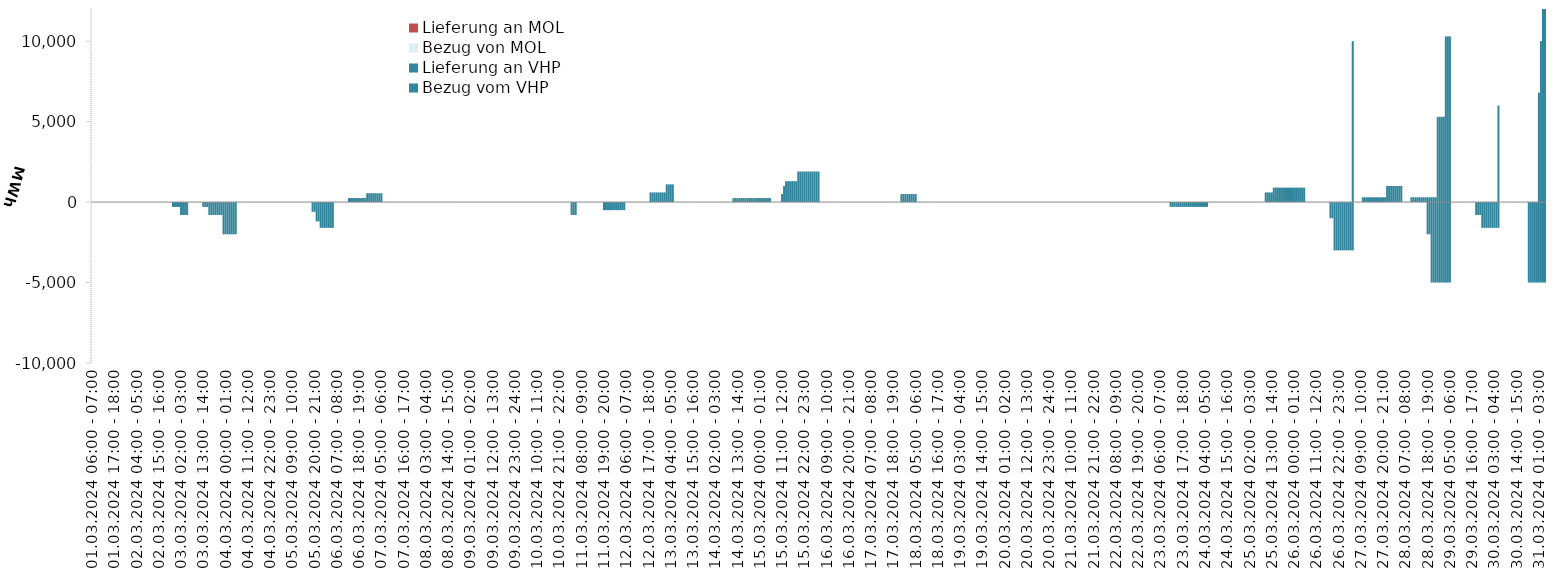
| Category | Bezug vom VHP | Lieferung an VHP | Bezug von MOL | Lieferung an MOL |
|---|---|---|---|---|
| 01.03.2024 06:00 - 07:00 | 0 | 0 | 0 | 0 |
| 01.03.2024 07:00 - 08:00 | 0 | 0 | 0 | 0 |
| 01.03.2024 08:00 - 09:00 | 0 | 0 | 0 | 0 |
| 01.03.2024 09:00 - 10:00 | 0 | 0 | 0 | 0 |
| 01.03.2024 10:00 - 11:00 | 0 | 0 | 0 | 0 |
| 01.03.2024 11:00 - 12:00 | 0 | 0 | 0 | 0 |
| 01.03.2024 12:00 - 13:00 | 0 | 0 | 0 | 0 |
| 01.03.2024 13:00 - 14:00 | 0 | 0 | 0 | 0 |
| 01.03.2024 14:00 - 15:00 | 0 | 0 | 0 | 0 |
| 01.03.2024 15:00 - 16:00 | 0 | 0 | 0 | 0 |
| 01.03.2024 16:00 - 17:00 | 0 | 0 | 0 | 0 |
| 01.03.2024 17:00 - 18:00 | 0 | 0 | 0 | 0 |
| 01.03.2024 18:00 - 19:00 | 0 | 0 | 0 | 0 |
| 01.03.2024 19:00 - 20:00 | 0 | 0 | 0 | 0 |
| 01.03.2024 20:00 - 21:00 | 0 | 0 | 0 | 0 |
| 01.03.2024 21:00 - 22:00 | 0 | 0 | 0 | 0 |
| 01.03.2024 22:00 - 23:00 | 0 | 0 | 0 | 0 |
| 01.03.2024 23:00 - 24:00 | 0 | 0 | 0 | 0 |
| 02.03.2024 00:00 - 01:00 | 0 | 0 | 0 | 0 |
| 02.03.2024 01:00 - 02:00 | 0 | 0 | 0 | 0 |
| 02.03.2024 02:00 - 03:00 | 0 | 0 | 0 | 0 |
| 02.03.2024 03:00 - 04:00 | 0 | 0 | 0 | 0 |
| 02.03.2024 04:00 - 05:00 | 0 | 0 | 0 | 0 |
| 02.03.2024 05:00 - 06:00 | 0 | 0 | 0 | 0 |
| 02.03.2024 06:00 - 07:00 | 0 | 0 | 0 | 0 |
| 02.03.2024 07:00 - 08:00 | 0 | 0 | 0 | 0 |
| 02.03.2024 08:00 - 09:00 | 0 | 0 | 0 | 0 |
| 02.03.2024 09:00 - 10:00 | 0 | 0 | 0 | 0 |
| 02.03.2024 10:00 - 11:00 | 0 | 0 | 0 | 0 |
| 02.03.2024 11:00 - 12:00 | 0 | 0 | 0 | 0 |
| 02.03.2024 12:00 - 13:00 | 0 | 0 | 0 | 0 |
| 02.03.2024 13:00 - 14:00 | 0 | 0 | 0 | 0 |
| 02.03.2024 14:00 - 15:00 | 0 | 0 | 0 | 0 |
| 02.03.2024 15:00 - 16:00 | 0 | 0 | 0 | 0 |
| 02.03.2024 16:00 - 17:00 | 0 | 0 | 0 | 0 |
| 02.03.2024 17:00 - 18:00 | 0 | 0 | 0 | 0 |
| 02.03.2024 18:00 - 19:00 | 0 | 0 | 0 | 0 |
| 02.03.2024 19:00 - 20:00 | 0 | 0 | 0 | 0 |
| 02.03.2024 20:00 - 21:00 | 0 | 0 | 0 | 0 |
| 02.03.2024 21:00 - 22:00 | 0 | 0 | 0 | 0 |
| 02.03.2024 22:00 - 23:00 | 0 | -300 | 0 | 0 |
| 02.03.2024 23:00 - 24:00 | 0 | -300 | 0 | 0 |
| 03.03.2024 00:00 - 01:00 | 0 | -300 | 0 | 0 |
| 03.03.2024 01:00 - 02:00 | 0 | -300 | 0 | 0 |
| 03.03.2024 02:00 - 03:00 | 0 | -800 | 0 | 0 |
| 03.03.2024 03:00 - 04:00 | 0 | -800 | 0 | 0 |
| 03.03.2024 04:00 - 05:00 | 0 | -800 | 0 | 0 |
| 03.03.2024 05:00 - 06:00 | 0 | -800 | 0 | 0 |
| 03.03.2024 06:00 - 07:00 | 0 | 0 | 0 | 0 |
| 03.03.2024 07:00 - 08:00 | 0 | 0 | 0 | 0 |
| 03.03.2024 08:00 - 09:00 | 0 | 0 | 0 | 0 |
| 03.03.2024 09:00 - 10:00 | 0 | 0 | 0 | 0 |
| 03.03.2024 10:00 - 11:00 | 0 | 0 | 0 | 0 |
| 03.03.2024 11:00 - 12:00 | 0 | 0 | 0 | 0 |
| 03.03.2024 12:00 - 13:00 | 0 | 0 | 0 | 0 |
| 03.03.2024 13:00 - 14:00 | 0 | -300 | 0 | 0 |
| 03.03.2024 14:00 - 15:00 | 0 | -300 | 0 | 0 |
| 03.03.2024 15:00 - 16:00 | 0 | -300 | 0 | 0 |
| 03.03.2024 16:00 - 17:00 | 0 | -800 | 0 | 0 |
| 03.03.2024 17:00 - 18:00 | 0 | -800 | 0 | 0 |
| 03.03.2024 18:00 - 19:00 | 0 | -800 | 0 | 0 |
| 03.03.2024 19:00 - 20:00 | 0 | -800 | 0 | 0 |
| 03.03.2024 20:00 - 21:00 | 0 | -800 | 0 | 0 |
| 03.03.2024 21:00 - 22:00 | 0 | -800 | 0 | 0 |
| 03.03.2024 22:00 - 23:00 | 0 | -800 | 0 | 0 |
| 03.03.2024 23:00 - 24:00 | 0 | -2000 | 0 | 0 |
| 04.03.2024 00:00 - 01:00 | 0 | -2000 | 0 | 0 |
| 04.03.2024 01:00 - 02:00 | 0 | -2000 | 0 | 0 |
| 04.03.2024 02:00 - 03:00 | 0 | -2000 | 0 | 0 |
| 04.03.2024 03:00 - 04:00 | 0 | -2000 | 0 | 0 |
| 04.03.2024 04:00 - 05:00 | 0 | -2000 | 0 | 0 |
| 04.03.2024 05:00 - 06:00 | 0 | -2000 | 0 | 0 |
| 04.03.2024 06:00 - 07:00 | 0 | 0 | 0 | 0 |
| 04.03.2024 07:00 - 08:00 | 0 | 0 | 0 | 0 |
| 04.03.2024 08:00 - 09:00 | 0 | 0 | 0 | 0 |
| 04.03.2024 09:00 - 10:00 | 0 | 0 | 0 | 0 |
| 04.03.2024 10:00 - 11:00 | 0 | 0 | 0 | 0 |
| 04.03.2024 11:00 - 12:00 | 0 | 0 | 0 | 0 |
| 04.03.2024 12:00 - 13:00 | 0 | 0 | 0 | 0 |
| 04.03.2024 13:00 - 14:00 | 0 | 0 | 0 | 0 |
| 04.03.2024 14:00 - 15:00 | 0 | 0 | 0 | 0 |
| 04.03.2024 15:00 - 16:00 | 0 | 0 | 0 | 0 |
| 04.03.2024 16:00 - 17:00 | 0 | 0 | 0 | 0 |
| 04.03.2024 17:00 - 18:00 | 0 | 0 | 0 | 0 |
| 04.03.2024 18:00 - 19:00 | 0 | 0 | 0 | 0 |
| 04.03.2024 19:00 - 20:00 | 0 | 0 | 0 | 0 |
| 04.03.2024 20:00 - 21:00 | 0 | 0 | 0 | 0 |
| 04.03.2024 21:00 - 22:00 | 0 | 0 | 0 | 0 |
| 04.03.2024 22:00 - 23:00 | 0 | 0 | 0 | 0 |
| 04.03.2024 23:00 - 24:00 | 0 | 0 | 0 | 0 |
| 05.03.2024 00:00 - 01:00 | 0 | 0 | 0 | 0 |
| 05.03.2024 01:00 - 02:00 | 0 | 0 | 0 | 0 |
| 05.03.2024 02:00 - 03:00 | 0 | 0 | 0 | 0 |
| 05.03.2024 03:00 - 04:00 | 0 | 0 | 0 | 0 |
| 05.03.2024 04:00 - 05:00 | 0 | 0 | 0 | 0 |
| 05.03.2024 05:00 - 06:00 | 0 | 0 | 0 | 0 |
| 05.03.2024 06:00 - 07:00 | 0 | 0 | 0 | 0 |
| 05.03.2024 07:00 - 08:00 | 0 | 0 | 0 | 0 |
| 05.03.2024 08:00 - 09:00 | 0 | 0 | 0 | 0 |
| 05.03.2024 09:00 - 10:00 | 0 | 0 | 0 | 0 |
| 05.03.2024 10:00 - 11:00 | 0 | 0 | 0 | 0 |
| 05.03.2024 11:00 - 12:00 | 0 | 0 | 0 | 0 |
| 05.03.2024 12:00 - 13:00 | 0 | 0 | 0 | 0 |
| 05.03.2024 13:00 - 14:00 | 0 | 0 | 0 | 0 |
| 05.03.2024 14:00 - 15:00 | 0 | 0 | 0 | 0 |
| 05.03.2024 15:00 - 16:00 | 0 | 0 | 0 | 0 |
| 05.03.2024 16:00 - 17:00 | 0 | 0 | 0 | 0 |
| 05.03.2024 17:00 - 18:00 | 0 | 0 | 0 | 0 |
| 05.03.2024 18:00 - 19:00 | 0 | 0 | 0 | 0 |
| 05.03.2024 19:00 - 20:00 | 0 | -600 | 0 | 0 |
| 05.03.2024 20:00 - 21:00 | 0 | -600 | 0 | 0 |
| 05.03.2024 21:00 - 22:00 | 0 | -1200 | 0 | 0 |
| 05.03.2024 22:00 - 23:00 | 0 | -1200 | 0 | 0 |
| 05.03.2024 23:00 - 24:00 | 0 | -1600 | 0 | 0 |
| 06.03.2024 00:00 - 01:00 | 0 | -1600 | 0 | 0 |
| 06.03.2024 01:00 - 02:00 | 0 | -1600 | 0 | 0 |
| 06.03.2024 02:00 - 03:00 | 0 | -1600 | 0 | 0 |
| 06.03.2024 03:00 - 04:00 | 0 | -1600 | 0 | 0 |
| 06.03.2024 04:00 - 05:00 | 0 | -1600 | 0 | 0 |
| 06.03.2024 05:00 - 06:00 | 0 | -1600 | 0 | 0 |
| 06.03.2024 06:00 - 07:00 | 0 | 0 | 0 | 0 |
| 06.03.2024 07:00 - 08:00 | 0 | 0 | 0 | 0 |
| 06.03.2024 08:00 - 09:00 | 0 | 0 | 0 | 0 |
| 06.03.2024 09:00 - 10:00 | 0 | 0 | 0 | 0 |
| 06.03.2024 10:00 - 11:00 | 0 | 0 | 0 | 0 |
| 06.03.2024 11:00 - 12:00 | 0 | 0 | 0 | 0 |
| 06.03.2024 12:00 - 13:00 | 0 | 0 | 0 | 0 |
| 06.03.2024 13:00 - 14:00 | 250 | 0 | 0 | 0 |
| 06.03.2024 14:00 - 15:00 | 250 | 0 | 0 | 0 |
| 06.03.2024 15:00 - 16:00 | 250 | 0 | 0 | 0 |
| 06.03.2024 16:00 - 17:00 | 250 | 0 | 0 | 0 |
| 06.03.2024 17:00 - 18:00 | 250 | 0 | 0 | 0 |
| 06.03.2024 18:00 - 19:00 | 250 | 0 | 0 | 0 |
| 06.03.2024 19:00 - 20:00 | 250 | 0 | 0 | 0 |
| 06.03.2024 20:00 - 21:00 | 250 | 0 | 0 | 0 |
| 06.03.2024 21:00 - 22:00 | 250 | 0 | 0 | 0 |
| 06.03.2024 22:00 - 23:00 | 550 | 0 | 0 | 0 |
| 06.03.2024 23:00 - 24:00 | 550 | 0 | 0 | 0 |
| 07.03.2024 00:00 - 01:00 | 550 | 0 | 0 | 0 |
| 07.03.2024 01:00 - 02:00 | 550 | 0 | 0 | 0 |
| 07.03.2024 02:00 - 03:00 | 550 | 0 | 0 | 0 |
| 07.03.2024 03:00 - 04:00 | 550 | 0 | 0 | 0 |
| 07.03.2024 04:00 - 05:00 | 550 | 0 | 0 | 0 |
| 07.03.2024 05:00 - 06:00 | 550 | 0 | 0 | 0 |
| 07.03.2024 06:00 - 07:00 | 0 | 0 | 0 | 0 |
| 07.03.2024 07:00 - 08:00 | 0 | 0 | 0 | 0 |
| 07.03.2024 08:00 - 09:00 | 0 | 0 | 0 | 0 |
| 07.03.2024 09:00 - 10:00 | 0 | 0 | 0 | 0 |
| 07.03.2024 10:00 - 11:00 | 0 | 0 | 0 | 0 |
| 07.03.2024 11:00 - 12:00 | 0 | 0 | 0 | 0 |
| 07.03.2024 12:00 - 13:00 | 0 | 0 | 0 | 0 |
| 07.03.2024 13:00 - 14:00 | 0 | 0 | 0 | 0 |
| 07.03.2024 14:00 - 15:00 | 0 | 0 | 0 | 0 |
| 07.03.2024 15:00 - 16:00 | 0 | 0 | 0 | 0 |
| 07.03.2024 16:00 - 17:00 | 0 | 0 | 0 | 0 |
| 07.03.2024 17:00 - 18:00 | 0 | 0 | 0 | 0 |
| 07.03.2024 18:00 - 19:00 | 0 | 0 | 0 | 0 |
| 07.03.2024 19:00 - 20:00 | 0 | 0 | 0 | 0 |
| 07.03.2024 20:00 - 21:00 | 0 | 0 | 0 | 0 |
| 07.03.2024 21:00 - 22:00 | 0 | 0 | 0 | 0 |
| 07.03.2024 22:00 - 23:00 | 0 | 0 | 0 | 0 |
| 07.03.2024 23:00 - 24:00 | 0 | 0 | 0 | 0 |
| 08.03.2024 00:00 - 01:00 | 0 | 0 | 0 | 0 |
| 08.03.2024 01:00 - 02:00 | 0 | 0 | 0 | 0 |
| 08.03.2024 02:00 - 03:00 | 0 | 0 | 0 | 0 |
| 08.03.2024 03:00 - 04:00 | 0 | 0 | 0 | 0 |
| 08.03.2024 04:00 - 05:00 | 0 | 0 | 0 | 0 |
| 08.03.2024 05:00 - 06:00 | 0 | 0 | 0 | 0 |
| 08.03.2024 06:00 - 07:00 | 0 | 0 | 0 | 0 |
| 08.03.2024 07:00 - 08:00 | 0 | 0 | 0 | 0 |
| 08.03.2024 08:00 - 09:00 | 0 | 0 | 0 | 0 |
| 08.03.2024 09:00 - 10:00 | 0 | 0 | 0 | 0 |
| 08.03.2024 10:00 - 11:00 | 0 | 0 | 0 | 0 |
| 08.03.2024 11:00 - 12:00 | 0 | 0 | 0 | 0 |
| 08.03.2024 12:00 - 13:00 | 0 | 0 | 0 | 0 |
| 08.03.2024 13:00 - 14:00 | 0 | 0 | 0 | 0 |
| 08.03.2024 14:00 - 15:00 | 0 | 0 | 0 | 0 |
| 08.03.2024 15:00 - 16:00 | 0 | 0 | 0 | 0 |
| 08.03.2024 16:00 - 17:00 | 0 | 0 | 0 | 0 |
| 08.03.2024 17:00 - 18:00 | 0 | 0 | 0 | 0 |
| 08.03.2024 18:00 - 19:00 | 0 | 0 | 0 | 0 |
| 08.03.2024 19:00 - 20:00 | 0 | 0 | 0 | 0 |
| 08.03.2024 20:00 - 21:00 | 0 | 0 | 0 | 0 |
| 08.03.2024 21:00 - 22:00 | 0 | 0 | 0 | 0 |
| 08.03.2024 22:00 - 23:00 | 0 | 0 | 0 | 0 |
| 08.03.2024 23:00 - 24:00 | 0 | 0 | 0 | 0 |
| 09.03.2024 00:00 - 01:00 | 0 | 0 | 0 | 0 |
| 09.03.2024 01:00 - 02:00 | 0 | 0 | 0 | 0 |
| 09.03.2024 02:00 - 03:00 | 0 | 0 | 0 | 0 |
| 09.03.2024 03:00 - 04:00 | 0 | 0 | 0 | 0 |
| 09.03.2024 04:00 - 05:00 | 0 | 0 | 0 | 0 |
| 09.03.2024 05:00 - 06:00 | 0 | 0 | 0 | 0 |
| 09.03.2024 06:00 - 07:00 | 0 | 0 | 0 | 0 |
| 09.03.2024 07:00 - 08:00 | 0 | 0 | 0 | 0 |
| 09.03.2024 08:00 - 09:00 | 0 | 0 | 0 | 0 |
| 09.03.2024 09:00 - 10:00 | 0 | 0 | 0 | 0 |
| 09.03.2024 10:00 - 11:00 | 0 | 0 | 0 | 0 |
| 09.03.2024 11:00 - 12:00 | 0 | 0 | 0 | 0 |
| 09.03.2024 12:00 - 13:00 | 0 | 0 | 0 | 0 |
| 09.03.2024 13:00 - 14:00 | 0 | 0 | 0 | 0 |
| 09.03.2024 14:00 - 15:00 | 0 | 0 | 0 | 0 |
| 09.03.2024 15:00 - 16:00 | 0 | 0 | 0 | 0 |
| 09.03.2024 16:00 - 17:00 | 0 | 0 | 0 | 0 |
| 09.03.2024 17:00 - 18:00 | 0 | 0 | 0 | 0 |
| 09.03.2024 18:00 - 19:00 | 0 | 0 | 0 | 0 |
| 09.03.2024 19:00 - 20:00 | 0 | 0 | 0 | 0 |
| 09.03.2024 20:00 - 21:00 | 0 | 0 | 0 | 0 |
| 09.03.2024 21:00 - 22:00 | 0 | 0 | 0 | 0 |
| 09.03.2024 22:00 - 23:00 | 0 | 0 | 0 | 0 |
| 09.03.2024 23:00 - 24:00 | 0 | 0 | 0 | 0 |
| 10.03.2024 00:00 - 01:00 | 0 | 0 | 0 | 0 |
| 10.03.2024 01:00 - 02:00 | 0 | 0 | 0 | 0 |
| 10.03.2024 02:00 - 03:00 | 0 | 0 | 0 | 0 |
| 10.03.2024 03:00 - 04:00 | 0 | 0 | 0 | 0 |
| 10.03.2024 04:00 - 05:00 | 0 | 0 | 0 | 0 |
| 10.03.2024 05:00 - 06:00 | 0 | 0 | 0 | 0 |
| 10.03.2024 06:00 - 07:00 | 0 | 0 | 0 | 0 |
| 10.03.2024 07:00 - 08:00 | 0 | 0 | 0 | 0 |
| 10.03.2024 08:00 - 09:00 | 0 | 0 | 0 | 0 |
| 10.03.2024 09:00 - 10:00 | 0 | 0 | 0 | 0 |
| 10.03.2024 10:00 - 11:00 | 0 | 0 | 0 | 0 |
| 10.03.2024 11:00 - 12:00 | 0 | 0 | 0 | 0 |
| 10.03.2024 12:00 - 13:00 | 0 | 0 | 0 | 0 |
| 10.03.2024 13:00 - 14:00 | 0 | 0 | 0 | 0 |
| 10.03.2024 14:00 - 15:00 | 0 | 0 | 0 | 0 |
| 10.03.2024 15:00 - 16:00 | 0 | 0 | 0 | 0 |
| 10.03.2024 16:00 - 17:00 | 0 | 0 | 0 | 0 |
| 10.03.2024 17:00 - 18:00 | 0 | 0 | 0 | 0 |
| 10.03.2024 18:00 - 19:00 | 0 | 0 | 0 | 0 |
| 10.03.2024 19:00 - 20:00 | 0 | 0 | 0 | 0 |
| 10.03.2024 20:00 - 21:00 | 0 | 0 | 0 | 0 |
| 10.03.2024 21:00 - 22:00 | 0 | 0 | 0 | 0 |
| 10.03.2024 22:00 - 23:00 | 0 | 0 | 0 | 0 |
| 10.03.2024 23:00 - 24:00 | 0 | 0 | 0 | 0 |
| 11.03.2024 00:00 - 01:00 | 0 | 0 | 0 | 0 |
| 11.03.2024 01:00 - 02:00 | 0 | 0 | 0 | 0 |
| 11.03.2024 02:00 - 03:00 | 0 | 0 | 0 | 0 |
| 11.03.2024 03:00 - 04:00 | 0 | -800 | 0 | 0 |
| 11.03.2024 04:00 - 05:00 | 0 | -800 | 0 | 0 |
| 11.03.2024 05:00 - 06:00 | 0 | -800 | 0 | 0 |
| 11.03.2024 06:00 - 07:00 | 0 | 0 | 0 | 0 |
| 11.03.2024 07:00 - 08:00 | 0 | 0 | 0 | 0 |
| 11.03.2024 08:00 - 09:00 | 0 | 0 | 0 | 0 |
| 11.03.2024 09:00 - 10:00 | 0 | 0 | 0 | 0 |
| 11.03.2024 10:00 - 11:00 | 0 | 0 | 0 | 0 |
| 11.03.2024 11:00 - 12:00 | 0 | 0 | 0 | 0 |
| 11.03.2024 12:00 - 13:00 | 0 | 0 | 0 | 0 |
| 11.03.2024 13:00 - 14:00 | 0 | 0 | 0 | 0 |
| 11.03.2024 14:00 - 15:00 | 0 | 0 | 0 | 0 |
| 11.03.2024 15:00 - 16:00 | 0 | 0 | 0 | 0 |
| 11.03.2024 16:00 - 17:00 | 0 | 0 | 0 | 0 |
| 11.03.2024 17:00 - 18:00 | 0 | 0 | 0 | 0 |
| 11.03.2024 18:00 - 19:00 | 0 | 0 | 0 | 0 |
| 11.03.2024 19:00 - 20:00 | 0 | -500 | 0 | 0 |
| 11.03.2024 20:00 - 21:00 | 0 | -500 | 0 | 0 |
| 11.03.2024 21:00 - 22:00 | 0 | -500 | 0 | 0 |
| 11.03.2024 22:00 - 23:00 | 0 | -500 | 0 | 0 |
| 11.03.2024 23:00 - 24:00 | 0 | -500 | 0 | 0 |
| 12.03.2024 00:00 - 01:00 | 0 | -500 | 0 | 0 |
| 12.03.2024 01:00 - 02:00 | 0 | -500 | 0 | 0 |
| 12.03.2024 02:00 - 03:00 | 0 | -500 | 0 | 0 |
| 12.03.2024 03:00 - 04:00 | 0 | -500 | 0 | 0 |
| 12.03.2024 04:00 - 05:00 | 0 | -500 | 0 | 0 |
| 12.03.2024 05:00 - 06:00 | 0 | -500 | 0 | 0 |
| 12.03.2024 06:00 - 07:00 | 0 | 0 | 0 | 0 |
| 12.03.2024 07:00 - 08:00 | 0 | 0 | 0 | 0 |
| 12.03.2024 08:00 - 09:00 | 0 | 0 | 0 | 0 |
| 12.03.2024 09:00 - 10:00 | 0 | 0 | 0 | 0 |
| 12.03.2024 10:00 - 11:00 | 0 | 0 | 0 | 0 |
| 12.03.2024 11:00 - 12:00 | 0 | 0 | 0 | 0 |
| 12.03.2024 12:00 - 13:00 | 0 | 0 | 0 | 0 |
| 12.03.2024 13:00 - 14:00 | 0 | 0 | 0 | 0 |
| 12.03.2024 14:00 - 15:00 | 0 | 0 | 0 | 0 |
| 12.03.2024 15:00 - 16:00 | 0 | 0 | 0 | 0 |
| 12.03.2024 16:00 - 17:00 | 0 | 0 | 0 | 0 |
| 12.03.2024 17:00 - 18:00 | 0 | 0 | 0 | 0 |
| 12.03.2024 18:00 - 19:00 | 600 | 0 | 0 | 0 |
| 12.03.2024 19:00 - 20:00 | 600 | 0 | 0 | 0 |
| 12.03.2024 20:00 - 21:00 | 600 | 0 | 0 | 0 |
| 12.03.2024 21:00 - 22:00 | 600 | 0 | 0 | 0 |
| 12.03.2024 22:00 - 23:00 | 600 | 0 | 0 | 0 |
| 12.03.2024 23:00 - 24:00 | 600 | 0 | 0 | 0 |
| 13.03.2024 00:00 - 01:00 | 600 | 0 | 0 | 0 |
| 13.03.2024 01:00 - 02:00 | 600 | 0 | 0 | 0 |
| 13.03.2024 02:00 - 03:00 | 1100 | 0 | 0 | 0 |
| 13.03.2024 03:00 - 04:00 | 1100 | 0 | 0 | 0 |
| 13.03.2024 04:00 - 05:00 | 1100 | 0 | 0 | 0 |
| 13.03.2024 05:00 - 06:00 | 1100 | 0 | 0 | 0 |
| 13.03.2024 06:00 - 07:00 | 0 | 0 | 0 | 0 |
| 13.03.2024 07:00 - 08:00 | 0 | 0 | 0 | 0 |
| 13.03.2024 08:00 - 09:00 | 0 | 0 | 0 | 0 |
| 13.03.2024 09:00 - 10:00 | 0 | 0 | 0 | 0 |
| 13.03.2024 10:00 - 11:00 | 0 | 0 | 0 | 0 |
| 13.03.2024 11:00 - 12:00 | 0 | 0 | 0 | 0 |
| 13.03.2024 12:00 - 13:00 | 0 | 0 | 0 | 0 |
| 13.03.2024 13:00 - 14:00 | 0 | 0 | 0 | 0 |
| 13.03.2024 14:00 - 15:00 | 0 | 0 | 0 | 0 |
| 13.03.2024 15:00 - 16:00 | 0 | 0 | 0 | 0 |
| 13.03.2024 16:00 - 17:00 | 0 | 0 | 0 | 0 |
| 13.03.2024 17:00 - 18:00 | 0 | 0 | 0 | 0 |
| 13.03.2024 18:00 - 19:00 | 0 | 0 | 0 | 0 |
| 13.03.2024 19:00 - 20:00 | 0 | 0 | 0 | 0 |
| 13.03.2024 20:00 - 21:00 | 0 | 0 | 0 | 0 |
| 13.03.2024 21:00 - 22:00 | 0 | 0 | 0 | 0 |
| 13.03.2024 22:00 - 23:00 | 0 | 0 | 0 | 0 |
| 13.03.2024 23:00 - 24:00 | 0 | 0 | 0 | 0 |
| 14.03.2024 00:00 - 01:00 | 0 | 0 | 0 | 0 |
| 14.03.2024 01:00 - 02:00 | 0 | 0 | 0 | 0 |
| 14.03.2024 02:00 - 03:00 | 0 | 0 | 0 | 0 |
| 14.03.2024 03:00 - 04:00 | 0 | 0 | 0 | 0 |
| 14.03.2024 04:00 - 05:00 | 0 | 0 | 0 | 0 |
| 14.03.2024 05:00 - 06:00 | 0 | 0 | 0 | 0 |
| 14.03.2024 06:00 - 07:00 | 0 | 0 | 0 | 0 |
| 14.03.2024 07:00 - 08:00 | 0 | 0 | 0 | 0 |
| 14.03.2024 08:00 - 09:00 | 0 | 0 | 0 | 0 |
| 14.03.2024 09:00 - 10:00 | 0 | 0 | 0 | 0 |
| 14.03.2024 10:00 - 11:00 | 0 | 0 | 0 | 0 |
| 14.03.2024 11:00 - 12:00 | 250 | 0 | 0 | 0 |
| 14.03.2024 12:00 - 13:00 | 250 | 0 | 0 | 0 |
| 14.03.2024 13:00 - 14:00 | 250 | 0 | 0 | 0 |
| 14.03.2024 14:00 - 15:00 | 250 | 0 | 0 | 0 |
| 14.03.2024 15:00 - 16:00 | 250 | 0 | 0 | 0 |
| 14.03.2024 16:00 - 17:00 | 250 | 0 | 0 | 0 |
| 14.03.2024 17:00 - 18:00 | 250 | 0 | 0 | 0 |
| 14.03.2024 18:00 - 19:00 | 250 | 0 | 0 | 0 |
| 14.03.2024 19:00 - 20:00 | 250 | 0 | 0 | 0 |
| 14.03.2024 20:00 - 21:00 | 250 | 0 | 0 | 0 |
| 14.03.2024 21:00 - 22:00 | 250 | 0 | 0 | 0 |
| 14.03.2024 22:00 - 23:00 | 250 | 0 | 0 | 0 |
| 14.03.2024 23:00 - 24:00 | 250 | 0 | 0 | 0 |
| 15.03.2024 00:00 - 01:00 | 250 | 0 | 0 | 0 |
| 15.03.2024 01:00 - 02:00 | 250 | 0 | 0 | 0 |
| 15.03.2024 02:00 - 03:00 | 250 | 0 | 0 | 0 |
| 15.03.2024 03:00 - 04:00 | 250 | 0 | 0 | 0 |
| 15.03.2024 04:00 - 05:00 | 250 | 0 | 0 | 0 |
| 15.03.2024 05:00 - 06:00 | 250 | 0 | 0 | 0 |
| 15.03.2024 06:00 - 07:00 | 0 | 0 | 0 | 0 |
| 15.03.2024 07:00 - 08:00 | 0 | 0 | 0 | 0 |
| 15.03.2024 08:00 - 09:00 | 0 | 0 | 0 | 0 |
| 15.03.2024 09:00 - 10:00 | 0 | 0 | 0 | 0 |
| 15.03.2024 10:00 - 11:00 | 0 | 0 | 0 | 0 |
| 15.03.2024 11:00 - 12:00 | 500 | 0 | 0 | 0 |
| 15.03.2024 12:00 - 13:00 | 1000 | 0 | 0 | 0 |
| 15.03.2024 13:00 - 14:00 | 1300 | 0 | 0 | 0 |
| 15.03.2024 14:00 - 15:00 | 1300 | 0 | 0 | 0 |
| 15.03.2024 15:00 - 16:00 | 1300 | 0 | 0 | 0 |
| 15.03.2024 16:00 - 17:00 | 1300 | 0 | 0 | 0 |
| 15.03.2024 17:00 - 18:00 | 1300 | 0 | 0 | 0 |
| 15.03.2024 18:00 - 19:00 | 1300 | 0 | 0 | 0 |
| 15.03.2024 19:00 - 20:00 | 1900 | 0 | 0 | 0 |
| 15.03.2024 20:00 - 21:00 | 1900 | 0 | 0 | 0 |
| 15.03.2024 21:00 - 22:00 | 1900 | 0 | 0 | 0 |
| 15.03.2024 22:00 - 23:00 | 1900 | 0 | 0 | 0 |
| 15.03.2024 23:00 - 24:00 | 1900 | 0 | 0 | 0 |
| 16.03.2024 00:00 - 01:00 | 1900 | 0 | 0 | 0 |
| 16.03.2024 01:00 - 02:00 | 1900 | 0 | 0 | 0 |
| 16.03.2024 02:00 - 03:00 | 1900 | 0 | 0 | 0 |
| 16.03.2024 03:00 - 04:00 | 1900 | 0 | 0 | 0 |
| 16.03.2024 04:00 - 05:00 | 1900 | 0 | 0 | 0 |
| 16.03.2024 05:00 - 06:00 | 1900 | 0 | 0 | 0 |
| 16.03.2024 06:00 - 07:00 | 0 | 0 | 0 | 0 |
| 16.03.2024 07:00 - 08:00 | 0 | 0 | 0 | 0 |
| 16.03.2024 08:00 - 09:00 | 0 | 0 | 0 | 0 |
| 16.03.2024 09:00 - 10:00 | 0 | 0 | 0 | 0 |
| 16.03.2024 10:00 - 11:00 | 0 | 0 | 0 | 0 |
| 16.03.2024 11:00 - 12:00 | 0 | 0 | 0 | 0 |
| 16.03.2024 12:00 - 13:00 | 0 | 0 | 0 | 0 |
| 16.03.2024 13:00 - 14:00 | 0 | 0 | 0 | 0 |
| 16.03.2024 14:00 - 15:00 | 0 | 0 | 0 | 0 |
| 16.03.2024 15:00 - 16:00 | 0 | 0 | 0 | 0 |
| 16.03.2024 16:00 - 17:00 | 0 | 0 | 0 | 0 |
| 16.03.2024 17:00 - 18:00 | 0 | 0 | 0 | 0 |
| 16.03.2024 18:00 - 19:00 | 0 | 0 | 0 | 0 |
| 16.03.2024 19:00 - 20:00 | 0 | 0 | 0 | 0 |
| 16.03.2024 20:00 - 21:00 | 0 | 0 | 0 | 0 |
| 16.03.2024 21:00 - 22:00 | 0 | 0 | 0 | 0 |
| 16.03.2024 22:00 - 23:00 | 0 | 0 | 0 | 0 |
| 16.03.2024 23:00 - 24:00 | 0 | 0 | 0 | 0 |
| 17.03.2024 00:00 - 01:00 | 0 | 0 | 0 | 0 |
| 17.03.2024 01:00 - 02:00 | 0 | 0 | 0 | 0 |
| 17.03.2024 02:00 - 03:00 | 0 | 0 | 0 | 0 |
| 17.03.2024 03:00 - 04:00 | 0 | 0 | 0 | 0 |
| 17.03.2024 04:00 - 05:00 | 0 | 0 | 0 | 0 |
| 17.03.2024 05:00 - 06:00 | 0 | 0 | 0 | 0 |
| 17.03.2024 06:00 - 07:00 | 0 | 0 | 0 | 0 |
| 17.03.2024 07:00 - 08:00 | 0 | 0 | 0 | 0 |
| 17.03.2024 08:00 - 09:00 | 0 | 0 | 0 | 0 |
| 17.03.2024 09:00 - 10:00 | 0 | 0 | 0 | 0 |
| 17.03.2024 10:00 - 11:00 | 0 | 0 | 0 | 0 |
| 17.03.2024 11:00 - 12:00 | 0 | 0 | 0 | 0 |
| 17.03.2024 12:00 - 13:00 | 0 | 0 | 0 | 0 |
| 17.03.2024 13:00 - 14:00 | 0 | 0 | 0 | 0 |
| 17.03.2024 14:00 - 15:00 | 0 | 0 | 0 | 0 |
| 17.03.2024 15:00 - 16:00 | 0 | 0 | 0 | 0 |
| 17.03.2024 16:00 - 17:00 | 0 | 0 | 0 | 0 |
| 17.03.2024 17:00 - 18:00 | 0 | 0 | 0 | 0 |
| 17.03.2024 18:00 - 19:00 | 0 | 0 | 0 | 0 |
| 17.03.2024 19:00 - 20:00 | 0 | 0 | 0 | 0 |
| 17.03.2024 20:00 - 21:00 | 0 | 0 | 0 | 0 |
| 17.03.2024 21:00 - 22:00 | 0 | 0 | 0 | 0 |
| 17.03.2024 22:00 - 23:00 | 500 | 0 | 0 | 0 |
| 17.03.2024 23:00 - 24:00 | 500 | 0 | 0 | 0 |
| 18.03.2024 00:00 - 01:00 | 500 | 0 | 0 | 0 |
| 18.03.2024 01:00 - 02:00 | 500 | 0 | 0 | 0 |
| 18.03.2024 02:00 - 03:00 | 500 | 0 | 0 | 0 |
| 18.03.2024 03:00 - 04:00 | 500 | 0 | 0 | 0 |
| 18.03.2024 04:00 - 05:00 | 500 | 0 | 0 | 0 |
| 18.03.2024 05:00 - 06:00 | 500 | 0 | 0 | 0 |
| 18.03.2024 06:00 - 07:00 | 0 | 0 | 0 | 0 |
| 18.03.2024 07:00 - 08:00 | 0 | 0 | 0 | 0 |
| 18.03.2024 08:00 - 09:00 | 0 | 0 | 0 | 0 |
| 18.03.2024 09:00 - 10:00 | 0 | 0 | 0 | 0 |
| 18.03.2024 10:00 - 11:00 | 0 | 0 | 0 | 0 |
| 18.03.2024 11:00 - 12:00 | 0 | 0 | 0 | 0 |
| 18.03.2024 12:00 - 13:00 | 0 | 0 | 0 | 0 |
| 18.03.2024 13:00 - 14:00 | 0 | 0 | 0 | 0 |
| 18.03.2024 14:00 - 15:00 | 0 | 0 | 0 | 0 |
| 18.03.2024 15:00 - 16:00 | 0 | 0 | 0 | 0 |
| 18.03.2024 16:00 - 17:00 | 0 | 0 | 0 | 0 |
| 18.03.2024 17:00 - 18:00 | 0 | 0 | 0 | 0 |
| 18.03.2024 18:00 - 19:00 | 0 | 0 | 0 | 0 |
| 18.03.2024 19:00 - 20:00 | 0 | 0 | 0 | 0 |
| 18.03.2024 20:00 - 21:00 | 0 | 0 | 0 | 0 |
| 18.03.2024 21:00 - 22:00 | 0 | 0 | 0 | 0 |
| 18.03.2024 22:00 - 23:00 | 0 | 0 | 0 | 0 |
| 18.03.2024 23:00 - 24:00 | 0 | 0 | 0 | 0 |
| 19.03.2024 00:00 - 01:00 | 0 | 0 | 0 | 0 |
| 19.03.2024 01:00 - 02:00 | 0 | 0 | 0 | 0 |
| 19.03.2024 02:00 - 03:00 | 0 | 0 | 0 | 0 |
| 19.03.2024 03:00 - 04:00 | 0 | 0 | 0 | 0 |
| 19.03.2024 04:00 - 05:00 | 0 | 0 | 0 | 0 |
| 19.03.2024 05:00 - 06:00 | 0 | 0 | 0 | 0 |
| 19.03.2024 06:00 - 07:00 | 0 | 0 | 0 | 0 |
| 19.03.2024 07:00 - 08:00 | 0 | 0 | 0 | 0 |
| 19.03.2024 08:00 - 09:00 | 0 | 0 | 0 | 0 |
| 19.03.2024 09:00 - 10:00 | 0 | 0 | 0 | 0 |
| 19.03.2024 10:00 - 11:00 | 0 | 0 | 0 | 0 |
| 19.03.2024 11:00 - 12:00 | 0 | 0 | 0 | 0 |
| 19.03.2024 12:00 - 13:00 | 0 | 0 | 0 | 0 |
| 19.03.2024 13:00 - 14:00 | 0 | 0 | 0 | 0 |
| 19.03.2024 14:00 - 15:00 | 0 | 0 | 0 | 0 |
| 19.03.2024 15:00 - 16:00 | 0 | 0 | 0 | 0 |
| 19.03.2024 16:00 - 17:00 | 0 | 0 | 0 | 0 |
| 19.03.2024 17:00 - 18:00 | 0 | 0 | 0 | 0 |
| 19.03.2024 18:00 - 19:00 | 0 | 0 | 0 | 0 |
| 19.03.2024 19:00 - 20:00 | 0 | 0 | 0 | 0 |
| 19.03.2024 20:00 - 21:00 | 0 | 0 | 0 | 0 |
| 19.03.2024 21:00 - 22:00 | 0 | 0 | 0 | 0 |
| 19.03.2024 22:00 - 23:00 | 0 | 0 | 0 | 0 |
| 19.03.2024 23:00 - 24:00 | 0 | 0 | 0 | 0 |
| 20.03.2024 00:00 - 01:00 | 0 | 0 | 0 | 0 |
| 20.03.2024 01:00 - 02:00 | 0 | 0 | 0 | 0 |
| 20.03.2024 02:00 - 03:00 | 0 | 0 | 0 | 0 |
| 20.03.2024 03:00 - 04:00 | 0 | 0 | 0 | 0 |
| 20.03.2024 04:00 - 05:00 | 0 | 0 | 0 | 0 |
| 20.03.2024 05:00 - 06:00 | 0 | 0 | 0 | 0 |
| 20.03.2024 06:00 - 07:00 | 0 | 0 | 0 | 0 |
| 20.03.2024 07:00 - 08:00 | 0 | 0 | 0 | 0 |
| 20.03.2024 08:00 - 09:00 | 0 | 0 | 0 | 0 |
| 20.03.2024 09:00 - 10:00 | 0 | 0 | 0 | 0 |
| 20.03.2024 10:00 - 11:00 | 0 | 0 | 0 | 0 |
| 20.03.2024 11:00 - 12:00 | 0 | 0 | 0 | 0 |
| 20.03.2024 12:00 - 13:00 | 0 | 0 | 0 | 0 |
| 20.03.2024 13:00 - 14:00 | 0 | 0 | 0 | 0 |
| 20.03.2024 14:00 - 15:00 | 0 | 0 | 0 | 0 |
| 20.03.2024 15:00 - 16:00 | 0 | 0 | 0 | 0 |
| 20.03.2024 16:00 - 17:00 | 0 | 0 | 0 | 0 |
| 20.03.2024 17:00 - 18:00 | 0 | 0 | 0 | 0 |
| 20.03.2024 18:00 - 19:00 | 0 | 0 | 0 | 0 |
| 20.03.2024 19:00 - 20:00 | 0 | 0 | 0 | 0 |
| 20.03.2024 20:00 - 21:00 | 0 | 0 | 0 | 0 |
| 20.03.2024 21:00 - 22:00 | 0 | 0 | 0 | 0 |
| 20.03.2024 22:00 - 23:00 | 0 | 0 | 0 | 0 |
| 20.03.2024 23:00 - 24:00 | 0 | 0 | 0 | 0 |
| 21.03.2024 00:00 - 01:00 | 0 | 0 | 0 | 0 |
| 21.03.2024 01:00 - 02:00 | 0 | 0 | 0 | 0 |
| 21.03.2024 02:00 - 03:00 | 0 | 0 | 0 | 0 |
| 21.03.2024 03:00 - 04:00 | 0 | 0 | 0 | 0 |
| 21.03.2024 04:00 - 05:00 | 0 | 0 | 0 | 0 |
| 21.03.2024 05:00 - 06:00 | 0 | 0 | 0 | 0 |
| 21.03.2024 06:00 - 07:00 | 0 | 0 | 0 | 0 |
| 21.03.2024 07:00 - 08:00 | 0 | 0 | 0 | 0 |
| 21.03.2024 08:00 - 09:00 | 0 | 0 | 0 | 0 |
| 21.03.2024 09:00 - 10:00 | 0 | 0 | 0 | 0 |
| 21.03.2024 10:00 - 11:00 | 0 | 0 | 0 | 0 |
| 21.03.2024 11:00 - 12:00 | 0 | 0 | 0 | 0 |
| 21.03.2024 12:00 - 13:00 | 0 | 0 | 0 | 0 |
| 21.03.2024 13:00 - 14:00 | 0 | 0 | 0 | 0 |
| 21.03.2024 14:00 - 15:00 | 0 | 0 | 0 | 0 |
| 21.03.2024 15:00 - 16:00 | 0 | 0 | 0 | 0 |
| 21.03.2024 16:00 - 17:00 | 0 | 0 | 0 | 0 |
| 21.03.2024 17:00 - 18:00 | 0 | 0 | 0 | 0 |
| 21.03.2024 18:00 - 19:00 | 0 | 0 | 0 | 0 |
| 21.03.2024 19:00 - 20:00 | 0 | 0 | 0 | 0 |
| 21.03.2024 20:00 - 21:00 | 0 | 0 | 0 | 0 |
| 21.03.2024 21:00 - 22:00 | 0 | 0 | 0 | 0 |
| 21.03.2024 22:00 - 23:00 | 0 | 0 | 0 | 0 |
| 21.03.2024 23:00 - 24:00 | 0 | 0 | 0 | 0 |
| 22.03.2024 00:00 - 01:00 | 0 | 0 | 0 | 0 |
| 22.03.2024 01:00 - 02:00 | 0 | 0 | 0 | 0 |
| 22.03.2024 02:00 - 03:00 | 0 | 0 | 0 | 0 |
| 22.03.2024 03:00 - 04:00 | 0 | 0 | 0 | 0 |
| 22.03.2024 04:00 - 05:00 | 0 | 0 | 0 | 0 |
| 22.03.2024 05:00 - 06:00 | 0 | 0 | 0 | 0 |
| 22.03.2024 06:00 - 07:00 | 0 | 0 | 0 | 0 |
| 22.03.2024 07:00 - 08:00 | 0 | 0 | 0 | 0 |
| 22.03.2024 08:00 - 09:00 | 0 | 0 | 0 | 0 |
| 22.03.2024 09:00 - 10:00 | 0 | 0 | 0 | 0 |
| 22.03.2024 10:00 - 11:00 | 0 | 0 | 0 | 0 |
| 22.03.2024 11:00 - 12:00 | 0 | 0 | 0 | 0 |
| 22.03.2024 12:00 - 13:00 | 0 | 0 | 0 | 0 |
| 22.03.2024 13:00 - 14:00 | 0 | 0 | 0 | 0 |
| 22.03.2024 14:00 - 15:00 | 0 | 0 | 0 | 0 |
| 22.03.2024 15:00 - 16:00 | 0 | 0 | 0 | 0 |
| 22.03.2024 16:00 - 17:00 | 0 | 0 | 0 | 0 |
| 22.03.2024 17:00 - 18:00 | 0 | 0 | 0 | 0 |
| 22.03.2024 18:00 - 19:00 | 0 | 0 | 0 | 0 |
| 22.03.2024 19:00 - 20:00 | 0 | 0 | 0 | 0 |
| 22.03.2024 20:00 - 21:00 | 0 | 0 | 0 | 0 |
| 22.03.2024 21:00 - 22:00 | 0 | 0 | 0 | 0 |
| 22.03.2024 22:00 - 23:00 | 0 | 0 | 0 | 0 |
| 22.03.2024 23:00 - 24:00 | 0 | 0 | 0 | 0 |
| 23.03.2024 00:00 - 01:00 | 0 | 0 | 0 | 0 |
| 23.03.2024 01:00 - 02:00 | 0 | 0 | 0 | 0 |
| 23.03.2024 02:00 - 03:00 | 0 | 0 | 0 | 0 |
| 23.03.2024 03:00 - 04:00 | 0 | 0 | 0 | 0 |
| 23.03.2024 04:00 - 05:00 | 0 | 0 | 0 | 0 |
| 23.03.2024 05:00 - 06:00 | 0 | 0 | 0 | 0 |
| 23.03.2024 06:00 - 07:00 | 0 | 0 | 0 | 0 |
| 23.03.2024 07:00 - 08:00 | 0 | 0 | 0 | 0 |
| 23.03.2024 08:00 - 09:00 | 0 | 0 | 0 | 0 |
| 23.03.2024 09:00 - 10:00 | 0 | 0 | 0 | 0 |
| 23.03.2024 10:00 - 11:00 | 0 | 0 | 0 | 0 |
| 23.03.2024 11:00 - 12:00 | 0 | -300 | 0 | 0 |
| 23.03.2024 12:00 - 13:00 | 0 | -300 | 0 | 0 |
| 23.03.2024 13:00 - 14:00 | 0 | -300 | 0 | 0 |
| 23.03.2024 14:00 - 15:00 | 0 | -300 | 0 | 0 |
| 23.03.2024 15:00 - 16:00 | 0 | -300 | 0 | 0 |
| 23.03.2024 16:00 - 17:00 | 0 | -300 | 0 | 0 |
| 23.03.2024 17:00 - 18:00 | 0 | -300 | 0 | 0 |
| 23.03.2024 18:00 - 19:00 | 0 | -300 | 0 | 0 |
| 23.03.2024 19:00 - 20:00 | 0 | -300 | 0 | 0 |
| 23.03.2024 20:00 - 21:00 | 0 | -300 | 0 | 0 |
| 23.03.2024 21:00 - 22:00 | 0 | -300 | 0 | 0 |
| 23.03.2024 22:00 - 23:00 | 0 | -300 | 0 | 0 |
| 23.03.2024 23:00 - 24:00 | 0 | -300 | 0 | 0 |
| 24.03.2024 00:00 - 01:00 | 0 | -300 | 0 | 0 |
| 24.03.2024 01:00 - 02:00 | 0 | -300 | 0 | 0 |
| 24.03.2024 02:00 - 03:00 | 0 | -300 | 0 | 0 |
| 24.03.2024 03:00 - 04:00 | 0 | -300 | 0 | 0 |
| 24.03.2024 04:00 - 05:00 | 0 | -300 | 0 | 0 |
| 24.03.2024 05:00 - 06:00 | 0 | -300 | 0 | 0 |
| 24.03.2024 06:00 - 07:00 | 0 | 0 | 0 | 0 |
| 24.03.2024 07:00 - 08:00 | 0 | 0 | 0 | 0 |
| 24.03.2024 08:00 - 09:00 | 0 | 0 | 0 | 0 |
| 24.03.2024 09:00 - 10:00 | 0 | 0 | 0 | 0 |
| 24.03.2024 10:00 - 11:00 | 0 | 0 | 0 | 0 |
| 24.03.2024 11:00 - 12:00 | 0 | 0 | 0 | 0 |
| 24.03.2024 12:00 - 13:00 | 0 | 0 | 0 | 0 |
| 24.03.2024 13:00 - 14:00 | 0 | 0 | 0 | 0 |
| 24.03.2024 14:00 - 15:00 | 0 | 0 | 0 | 0 |
| 24.03.2024 15:00 - 16:00 | 0 | 0 | 0 | 0 |
| 24.03.2024 16:00 - 17:00 | 0 | 0 | 0 | 0 |
| 24.03.2024 17:00 - 18:00 | 0 | 0 | 0 | 0 |
| 24.03.2024 18:00 - 19:00 | 0 | 0 | 0 | 0 |
| 24.03.2024 19:00 - 20:00 | 0 | 0 | 0 | 0 |
| 24.03.2024 20:00 - 21:00 | 0 | 0 | 0 | 0 |
| 24.03.2024 21:00 - 22:00 | 0 | 0 | 0 | 0 |
| 24.03.2024 22:00 - 23:00 | 0 | 0 | 0 | 0 |
| 24.03.2024 23:00 - 24:00 | 0 | 0 | 0 | 0 |
| 25.03.2024 00:00 - 01:00 | 0 | 0 | 0 | 0 |
| 25.03.2024 01:00 - 02:00 | 0 | 0 | 0 | 0 |
| 25.03.2024 02:00 - 03:00 | 0 | 0 | 0 | 0 |
| 25.03.2024 03:00 - 04:00 | 0 | 0 | 0 | 0 |
| 25.03.2024 04:00 - 05:00 | 0 | 0 | 0 | 0 |
| 25.03.2024 05:00 - 06:00 | 0 | 0 | 0 | 0 |
| 25.03.2024 06:00 - 07:00 | 0 | 0 | 0 | 0 |
| 25.03.2024 07:00 - 08:00 | 0 | 0 | 0 | 0 |
| 25.03.2024 08:00 - 09:00 | 0 | 0 | 0 | 0 |
| 25.03.2024 09:00 - 10:00 | 0 | 0 | 0 | 0 |
| 25.03.2024 10:00 - 11:00 | 600 | 0 | 0 | 0 |
| 25.03.2024 11:00 - 12:00 | 600 | 0 | 0 | 0 |
| 25.03.2024 12:00 - 13:00 | 600 | 0 | 0 | 0 |
| 25.03.2024 13:00 - 14:00 | 600 | 0 | 0 | 0 |
| 25.03.2024 14:00 - 15:00 | 900 | 0 | 0 | 0 |
| 25.03.2024 15:00 - 16:00 | 900 | 0 | 0 | 0 |
| 25.03.2024 16:00 - 17:00 | 900 | 0 | 0 | 0 |
| 25.03.2024 17:00 - 18:00 | 900 | 0 | 0 | 0 |
| 25.03.2024 18:00 - 19:00 | 900 | 0 | 0 | 0 |
| 25.03.2024 19:00 - 20:00 | 900 | 0 | 0 | 0 |
| 25.03.2024 20:00 - 21:00 | 900 | 0 | 0 | 0 |
| 25.03.2024 21:00 - 22:00 | 900 | 0 | 0 | 0 |
| 25.03.2024 22:00 - 23:00 | 900 | 0 | 0 | 0 |
| 25.03.2024 23:00 - 24:00 | 900 | 0 | 0 | 0 |
| 26.03.2024 00:00 - 01:00 | 900 | 0 | 0 | 0 |
| 26.03.2024 01:00 - 02:00 | 900 | 0 | 0 | 0 |
| 26.03.2024 02:00 - 03:00 | 900 | 0 | 0 | 0 |
| 26.03.2024 03:00 - 04:00 | 900 | 0 | 0 | 0 |
| 26.03.2024 04:00 - 05:00 | 900 | 0 | 0 | 0 |
| 26.03.2024 05:00 - 06:00 | 900 | 0 | 0 | 0 |
| 26.03.2024 06:00 - 07:00 | 0 | 0 | 0 | 0 |
| 26.03.2024 07:00 - 08:00 | 0 | 0 | 0 | 0 |
| 26.03.2024 08:00 - 09:00 | 0 | 0 | 0 | 0 |
| 26.03.2024 09:00 - 10:00 | 0 | 0 | 0 | 0 |
| 26.03.2024 10:00 - 11:00 | 0 | 0 | 0 | 0 |
| 26.03.2024 11:00 - 12:00 | 0 | 0 | 0 | 0 |
| 26.03.2024 12:00 - 13:00 | 0 | 0 | 0 | 0 |
| 26.03.2024 13:00 - 14:00 | 0 | 0 | 0 | 0 |
| 26.03.2024 14:00 - 15:00 | 0 | 0 | 0 | 0 |
| 26.03.2024 15:00 - 16:00 | 0 | 0 | 0 | 0 |
| 26.03.2024 16:00 - 17:00 | 0 | 0 | 0 | 0 |
| 26.03.2024 17:00 - 18:00 | 0 | 0 | 0 | 0 |
| 26.03.2024 18:00 - 19:00 | 0 | -1000 | 0 | 0 |
| 26.03.2024 19:00 - 20:00 | 0 | -1000 | 0 | 0 |
| 26.03.2024 20:00 - 21:00 | 0 | -3000 | 0 | 0 |
| 26.03.2024 21:00 - 22:00 | 0 | -3000 | 0 | 0 |
| 26.03.2024 22:00 - 23:00 | 0 | -3000 | 0 | 0 |
| 26.03.2024 23:00 - 24:00 | 0 | -3000 | 0 | 0 |
| 27.03.2024 00:00 - 01:00 | 0 | -3000 | 0 | 0 |
| 27.03.2024 01:00 - 02:00 | 0 | -3000 | 0 | 0 |
| 27.03.2024 02:00 - 03:00 | 0 | -3000 | 0 | 0 |
| 27.03.2024 03:00 - 04:00 | 0 | -3000 | 0 | 0 |
| 27.03.2024 04:00 - 05:00 | 0 | -3000 | 0 | 0 |
| 27.03.2024 05:00 - 06:00 | 10000 | -3000 | 0 | 0 |
| 27.03.2024 06:00 - 07:00 | 0 | 0 | 0 | 0 |
| 27.03.2024 07:00 - 08:00 | 0 | 0 | 0 | 0 |
| 27.03.2024 08:00 - 09:00 | 0 | 0 | 0 | 0 |
| 27.03.2024 09:00 - 10:00 | 0 | 0 | 0 | 0 |
| 27.03.2024 10:00 - 11:00 | 300 | 0 | 0 | 0 |
| 27.03.2024 11:00 - 12:00 | 300 | 0 | 0 | 0 |
| 27.03.2024 12:00 - 13:00 | 300 | 0 | 0 | 0 |
| 27.03.2024 13:00 - 14:00 | 300 | 0 | 0 | 0 |
| 27.03.2024 14:00 - 15:00 | 300 | 0 | 0 | 0 |
| 27.03.2024 15:00 - 16:00 | 300 | 0 | 0 | 0 |
| 27.03.2024 16:00 - 17:00 | 300 | 0 | 0 | 0 |
| 27.03.2024 17:00 - 18:00 | 300 | 0 | 0 | 0 |
| 27.03.2024 18:00 - 19:00 | 300 | 0 | 0 | 0 |
| 27.03.2024 19:00 - 20:00 | 300 | 0 | 0 | 0 |
| 27.03.2024 20:00 - 21:00 | 300 | 0 | 0 | 0 |
| 27.03.2024 21:00 - 22:00 | 300 | 0 | 0 | 0 |
| 27.03.2024 22:00 - 23:00 | 1000 | 0 | 0 | 0 |
| 27.03.2024 23:00 - 24:00 | 1000 | 0 | 0 | 0 |
| 28.03.2024 00:00 - 01:00 | 1000 | 0 | 0 | 0 |
| 28.03.2024 01:00 - 02:00 | 1000 | 0 | 0 | 0 |
| 28.03.2024 02:00 - 03:00 | 1000 | 0 | 0 | 0 |
| 28.03.2024 03:00 - 04:00 | 1000 | 0 | 0 | 0 |
| 28.03.2024 04:00 - 05:00 | 1000 | 0 | 0 | 0 |
| 28.03.2024 05:00 - 06:00 | 1000 | 0 | 0 | 0 |
| 28.03.2024 06:00 - 07:00 | 0 | 0 | 0 | 0 |
| 28.03.2024 07:00 - 08:00 | 0 | 0 | 0 | 0 |
| 28.03.2024 08:00 - 09:00 | 0 | 0 | 0 | 0 |
| 28.03.2024 09:00 - 10:00 | 0 | 0 | 0 | 0 |
| 28.03.2024 10:00 - 11:00 | 300 | 0 | 0 | 0 |
| 28.03.2024 11:00 - 12:00 | 300 | 0 | 0 | 0 |
| 28.03.2024 12:00 - 13:00 | 300 | 0 | 0 | 0 |
| 28.03.2024 13:00 - 14:00 | 300 | 0 | 0 | 0 |
| 28.03.2024 14:00 - 15:00 | 300 | 0 | 0 | 0 |
| 28.03.2024 15:00 - 16:00 | 300 | 0 | 0 | 0 |
| 28.03.2024 16:00 - 17:00 | 300 | 0 | 0 | 0 |
| 28.03.2024 17:00 - 18:00 | 300 | 0 | 0 | 0 |
| 28.03.2024 18:00 - 19:00 | 300 | -2000 | 0 | 0 |
| 28.03.2024 19:00 - 20:00 | 300 | -2000 | 0 | 0 |
| 28.03.2024 20:00 - 21:00 | 300 | -5000 | 0 | 0 |
| 28.03.2024 21:00 - 22:00 | 300 | -5000 | 0 | 0 |
| 28.03.2024 22:00 - 23:00 | 300 | -5000 | 0 | 0 |
| 28.03.2024 23:00 - 24:00 | 5300 | -5000 | 0 | 0 |
| 29.03.2024 00:00 - 01:00 | 5300 | -5000 | 0 | 0 |
| 29.03.2024 01:00 - 02:00 | 5300 | -5000 | 0 | 0 |
| 29.03.2024 02:00 - 03:00 | 5300 | -5000 | 0 | 0 |
| 29.03.2024 03:00 - 04:00 | 10300 | -5000 | 0 | 0 |
| 29.03.2024 04:00 - 05:00 | 10300 | -5000 | 0 | 0 |
| 29.03.2024 05:00 - 06:00 | 10300 | -5000 | 0 | 0 |
| 29.03.2024 06:00 - 07:00 | 0 | 0 | 0 | 0 |
| 29.03.2024 07:00 - 08:00 | 0 | 0 | 0 | 0 |
| 29.03.2024 08:00 - 09:00 | 0 | 0 | 0 | 0 |
| 29.03.2024 09:00 - 10:00 | 0 | 0 | 0 | 0 |
| 29.03.2024 10:00 - 11:00 | 0 | 0 | 0 | 0 |
| 29.03.2024 11:00 - 12:00 | 0 | 0 | 0 | 0 |
| 29.03.2024 12:00 - 13:00 | 0 | 0 | 0 | 0 |
| 29.03.2024 13:00 - 14:00 | 0 | 0 | 0 | 0 |
| 29.03.2024 14:00 - 15:00 | 0 | 0 | 0 | 0 |
| 29.03.2024 15:00 - 16:00 | 0 | 0 | 0 | 0 |
| 29.03.2024 16:00 - 17:00 | 0 | 0 | 0 | 0 |
| 29.03.2024 17:00 - 18:00 | 0 | 0 | 0 | 0 |
| 29.03.2024 18:00 - 19:00 | 0 | -800 | 0 | 0 |
| 29.03.2024 19:00 - 20:00 | 0 | -800 | 0 | 0 |
| 29.03.2024 20:00 - 21:00 | 0 | -800 | 0 | 0 |
| 29.03.2024 21:00 - 22:00 | 0 | -1600 | 0 | 0 |
| 29.03.2024 22:00 - 23:00 | 0 | -1600 | 0 | 0 |
| 29.03.2024 23:00 - 24:00 | 0 | -1600 | 0 | 0 |
| 30.03.2024 00:00 - 01:00 | 0 | -1600 | 0 | 0 |
| 30.03.2024 01:00 - 02:00 | 0 | -1600 | 0 | 0 |
| 30.03.2024 02:00 - 03:00 | 0 | -1600 | 0 | 0 |
| 30.03.2024 03:00 - 04:00 | 0 | -1600 | 0 | 0 |
| 30.03.2024 04:00 - 05:00 | 0 | -1600 | 0 | 0 |
| 30.03.2024 05:00 - 06:00 | 6000 | -1600 | 0 | 0 |
| 30.03.2024 06:00 - 07:00 | 0 | 0 | 0 | 0 |
| 30.03.2024 07:00 - 08:00 | 0 | 0 | 0 | 0 |
| 30.03.2024 08:00 - 09:00 | 0 | 0 | 0 | 0 |
| 30.03.2024 09:00 - 10:00 | 0 | 0 | 0 | 0 |
| 30.03.2024 10:00 - 11:00 | 0 | 0 | 0 | 0 |
| 30.03.2024 11:00 - 12:00 | 0 | 0 | 0 | 0 |
| 30.03.2024 12:00 - 13:00 | 0 | 0 | 0 | 0 |
| 30.03.2024 13:00 - 14:00 | 0 | 0 | 0 | 0 |
| 30.03.2024 14:00 - 15:00 | 0 | 0 | 0 | 0 |
| 30.03.2024 15:00 - 16:00 | 0 | 0 | 0 | 0 |
| 30.03.2024 16:00 - 17:00 | 0 | 0 | 0 | 0 |
| 30.03.2024 17:00 - 18:00 | 0 | 0 | 0 | 0 |
| 30.03.2024 18:00 - 19:00 | 0 | 0 | 0 | 0 |
| 30.03.2024 19:00 - 20:00 | 0 | 0 | 0 | 0 |
| 30.03.2024 20:00 - 21:00 | 0 | -5000 | 0 | 0 |
| 30.03.2024 21:00 - 22:00 | 0 | -5000 | 0 | 0 |
| 30.03.2024 22:00 - 23:00 | 0 | -5000 | 0 | 0 |
| 30.03.2024 23:00 - 24:00 | 0 | -5000 | 0 | 0 |
| 31.03.2024 00:00 - 01:00 | 0 | -5000 | 0 | 0 |
| 31.03.2024 01:00 - 03:00 | 6800 | -5000 | 0 | 0 |
| 31.03.2024 03:00 - 04:00 | 10000 | -5000 | 0 | 0 |
| 31.03.2024 04:00 - 05:00 | 14000 | -5000 | 0 | 0 |
| 31.03.2024 05:00 - 06:00 | 16126 | -5000 | 0 | 0 |